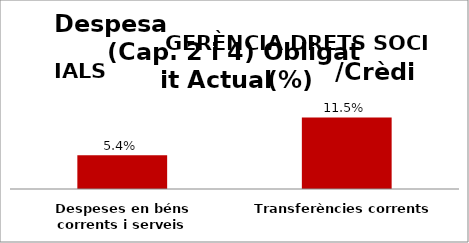
| Category | Series 0 |
|---|---|
| Despeses en béns corrents i serveis | 0.054 |
| Transferències corrents | 0.115 |